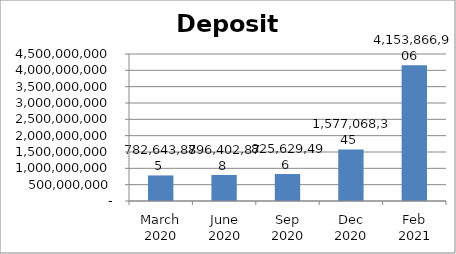
| Category | Deposit balance(USD) |
|---|---|
| March 2020 | 782643884.892 |
| June 2020 | 796402877.698 |
| Sep 2020 | 825629496.403 |
| Dec 2020 | 1577068345.324 |
| Feb 2021 | 4153866906.475 |